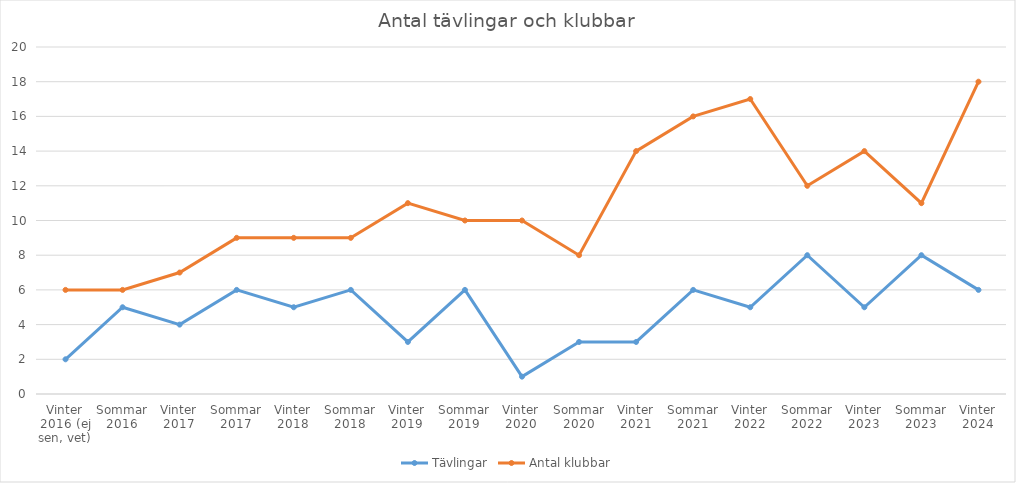
| Category | Tävlingar | Antal klubbar |
|---|---|---|
| Vinter 2016 (ej sen, vet) | 2 | 6 |
| Sommar 2016 | 5 | 6 |
| Vinter 2017 | 4 | 7 |
| Sommar 2017 | 6 | 9 |
| Vinter 2018 | 5 | 9 |
| Sommar 2018 | 6 | 9 |
| Vinter 2019 | 3 | 11 |
| Sommar 2019 | 6 | 10 |
| Vinter 2020 | 1 | 10 |
| Sommar 2020 | 3 | 8 |
| Vinter 2021 | 3 | 14 |
| Sommar 2021 | 6 | 16 |
| Vinter 2022 | 5 | 17 |
| Sommar 2022 | 8 | 12 |
| Vinter 2023 | 5 | 14 |
| Sommar 2023 | 8 | 11 |
| Vinter 2024 | 6 | 18 |